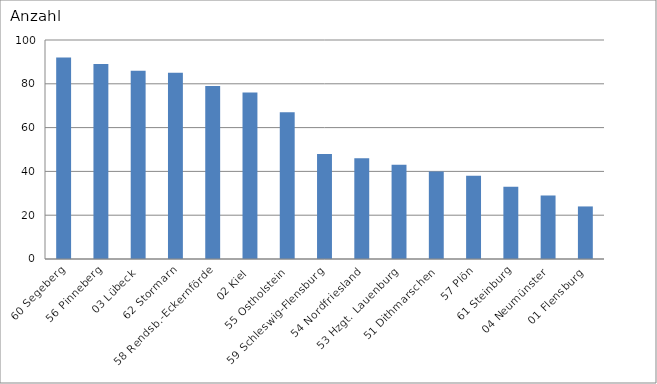
| Category | 60 Segeberg 56 Pinneberg 03 Lübeck 62 Stormarn 58 Rendsb.-Eckernförde 02 Kiel 55 Ostholstein 59 Schleswig-Flensburg 54 Nordfriesland 53 Hzgt. Lauenburg 51 Dithmarschen 57 Plön 61 Steinburg 04 Neumünster 01 Flensburg |
|---|---|
| 60 Segeberg | 92 |
| 56 Pinneberg | 89 |
| 03 Lübeck | 86 |
| 62 Stormarn | 85 |
| 58 Rendsb.-Eckernförde | 79 |
| 02 Kiel | 76 |
| 55 Ostholstein | 67 |
| 59 Schleswig-Flensburg | 48 |
| 54 Nordfriesland | 46 |
| 53 Hzgt. Lauenburg | 43 |
| 51 Dithmarschen | 40 |
| 57 Plön | 38 |
| 61 Steinburg | 33 |
| 04 Neumünster | 29 |
| 01 Flensburg | 24 |